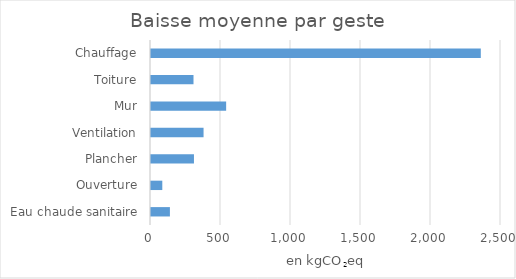
| Category | Baisse moyenne |
|---|---|
| Eau chaude sanitaire | 135.047 |
| Ouverture | 80.673 |
| Plancher | 306.838 |
| Ventilation | 375.395 |
| Mur | 536.731 |
| Toiture | 303.583 |
| Chauffage | 2355.742 |